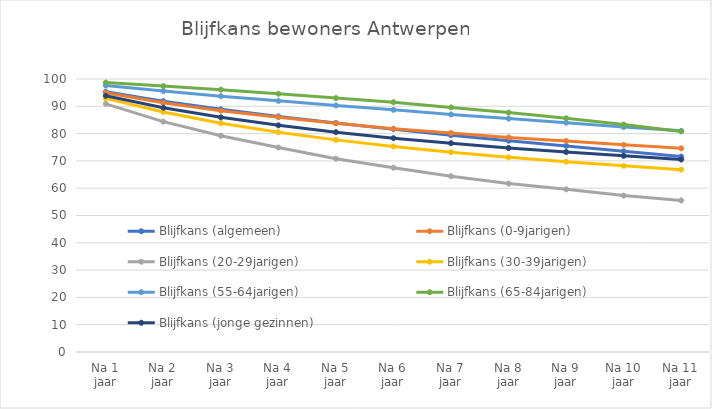
| Category | Blijfkans (algemeen) | Blijfkans (0-9jarigen) | Blijfkans (20-29jarigen) | Blijfkans (30-39jarigen) | Blijfkans (55-64jarigen) | Blijfkans (65-84jarigen) | Blijfkans (jonge gezinnen) |
|---|---|---|---|---|---|---|---|
| Na 1 jaar | 95.3 | 95 | 90.9 | 92.9 | 97.6 | 98.7 | 93.851 |
| Na 2 jaar | 91.9 | 91.3 | 84.4 | 87.9 | 95.6 | 97.4 | 89.477 |
| Na 3 jaar | 88.9 | 88.4 | 79.2 | 83.8 | 93.7 | 96.1 | 85.956 |
| Na 4 jaar | 86.3 | 86 | 74.9 | 80.5 | 92 | 94.6 | 83.026 |
| Na 5 jaar | 83.9 | 83.8 | 70.8 | 77.7 | 90.3 | 93 | 80.518 |
| Na 6 jaar | 81.6 | 81.8 | 67.5 | 75.3 | 88.7 | 91.5 | 78.331 |
| Na 7 jaar | 79.4 | 80.2 | 64.4 | 73.2 | 87 | 89.6 | 76.495 |
| Na 8 jaar | 77.4 | 78.6 | 61.7 | 71.3 | 85.5 | 87.7 | 74.707 |
| Na 9 jaar | 75.5 | 77.3 | 59.6 | 69.7 | 84 | 85.6 | 73.25 |
| Na 10 jaar | 73.5 | 75.9 | 57.3 | 68.2 | 82.4 | 83.3 | 71.846 |
| Na 11 jaar | 71.6 | 74.6 | 55.5 | 66.8 | 81 | 80.8 | 70.5 |